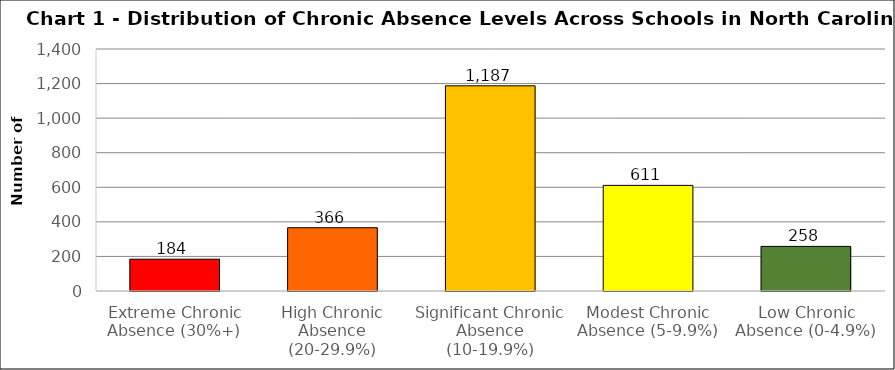
| Category | Series 0 |
|---|---|
| Extreme Chronic Absence (30%+) | 184 |
| High Chronic Absence (20-29.9%) | 366 |
| Significant Chronic Absence (10-19.9%) | 1187 |
| Modest Chronic Absence (5-9.9%) | 611 |
| Low Chronic Absence (0-4.9%) | 258 |